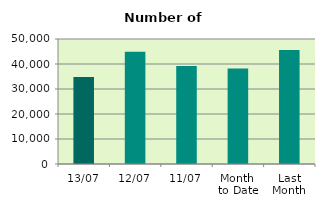
| Category | Series 0 |
|---|---|
| 13/07 | 34796 |
| 12/07 | 44872 |
| 11/07 | 39248 |
| Month 
to Date | 38230.222 |
| Last
Month | 45645.364 |